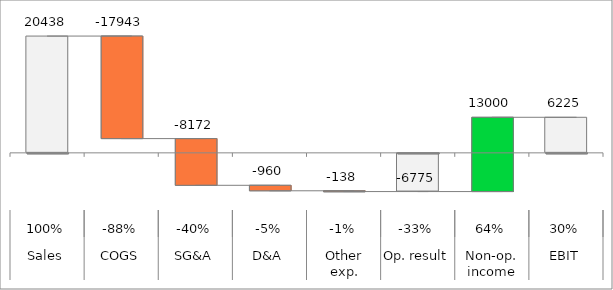
| Category | totals |
|---|---|
| 0 | 20438 |
| 1 | 0 |
| 2 | 0 |
| 3 | 0 |
| 4 | 0 |
| 5 | -6775 |
| 6 | 0 |
| 7 | 6225 |